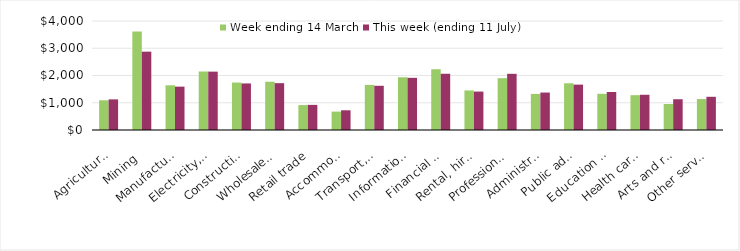
| Category | Week ending 14 March | This week (ending 11 July) |
|---|---|---|
| Agriculture, forestry and fishing | 1089.63 | 1124.04 |
| Mining | 3616.49 | 2874.84 |
| Manufacturing | 1640.46 | 1591.67 |
| Electricity, gas, water and waste services | 2146.49 | 2142.08 |
| Construction | 1740.97 | 1708.72 |
| Wholesale trade | 1771.63 | 1718.99 |
| Retail trade | 914.53 | 921.93 |
| Accommodation and food services | 675.02 | 723.06 |
| Transport, postal and warehousing | 1655.57 | 1622.64 |
| Information media and telecommunications | 1936.2 | 1914.76 |
| Financial and insurance services | 2229.72 | 2063.49 |
| Rental, hiring and real estate services | 1451.85 | 1410.31 |
| Professional, scientific and technical services | 1900.57 | 2061.86 |
| Administrative and support services | 1323.29 | 1374.37 |
| Public administration and safety | 1714.63 | 1664.87 |
| Education and training | 1328 | 1394.94 |
| Health care and social assistance | 1278.26 | 1293.22 |
| Arts and recreation services | 954.84 | 1129.35 |
| Other services | 1135.07 | 1218.56 |